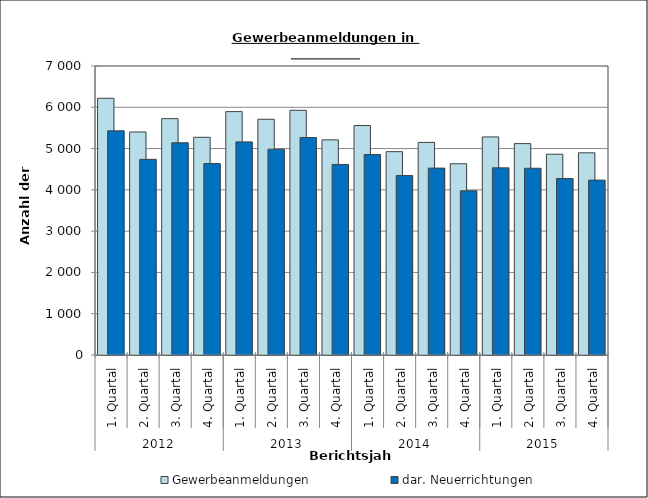
| Category | Gewerbeanmeldungen | dar. Neuerrichtungen |
|---|---|---|
| 0 | 6218 | 5430 |
| 1 | 5402 | 4739 |
| 2 | 5725 | 5140 |
| 3 | 5273 | 4636 |
| 4 | 5895 | 5162 |
| 5 | 5710 | 4985 |
| 6 | 5927 | 5267 |
| 7 | 5211 | 4615 |
| 8 | 5558 | 4856 |
| 9 | 4925 | 4346 |
| 10 | 5149 | 4527 |
| 11 | 4632 | 3977 |
| 12 | 5282 | 4533 |
| 13 | 5120 | 4523 |
| 14 | 4863 | 4274 |
| 15 | 4897 | 4236 |